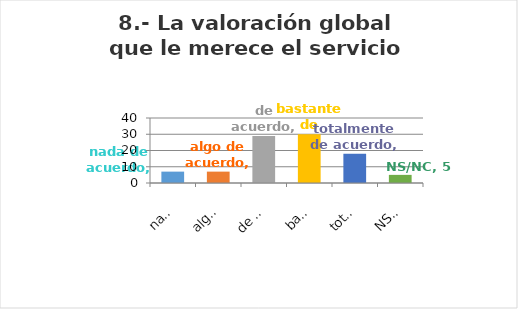
| Category | Series 0 |
|---|---|
| nada de acuerdo | 7 |
| algo de acuerdo | 7 |
| de acuerdo | 29 |
| bastante de acuerdo | 30 |
| totalmente de acuerdo | 18 |
| NS/NC | 5 |